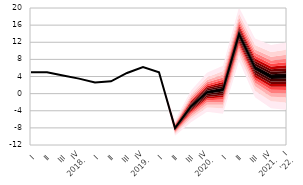
| Category | Series 0 |
|---|---|
| I | 4.965 |
| II | 4.992 |
| III | 4.212 |
| IV
2018. | 3.505 |
| I | 2.609 |
| II | 2.885 |
| III | 4.821 |
| IV
2019. | 6.203 |
| I | 5 |
| II | -8.038 |
| III | -2.99 |
| IV
2020. | 0.297 |
| I | 0.919 |
| II | 13.888 |
| III | 6.016 |
| IV
2021. | 3.957 |
| I
'22. | 4.1 |